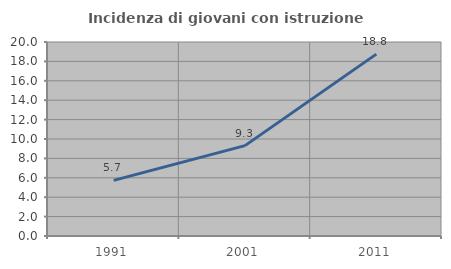
| Category | Incidenza di giovani con istruzione universitaria |
|---|---|
| 1991.0 | 5.738 |
| 2001.0 | 9.317 |
| 2011.0 | 18.75 |